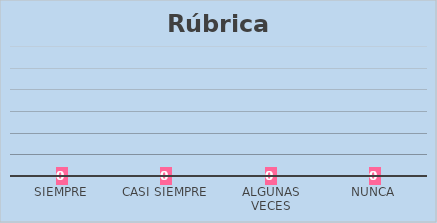
| Category | Series 0 |
|---|---|
| Siempre | 0 |
| Casi siempre | 0 |
| Algunas veces | 0 |
| Nunca | 0 |